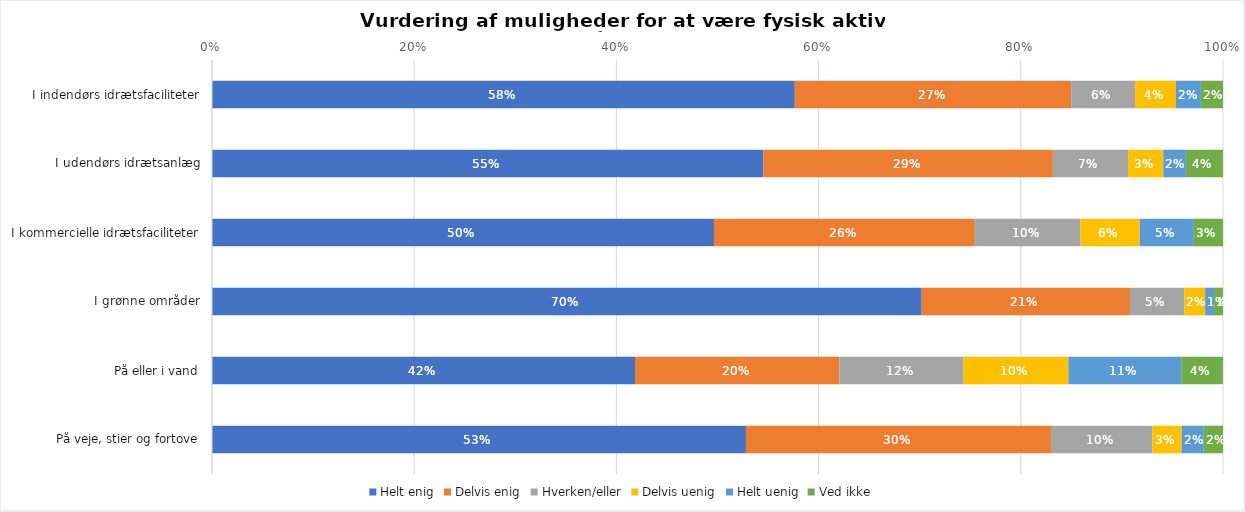
| Category | Helt enig | Delvis enig | Hverken/eller | Delvis uenig | Helt uenig | Ved ikke |
|---|---|---|---|---|---|---|
| I indendørs idrætsfaciliteter | 0.576 | 0.273 | 0.063 | 0.04 | 0.025 | 0.022 |
| I udendørs idrætsanlæg | 0.545 | 0.286 | 0.074 | 0.035 | 0.022 | 0.037 |
| I kommercielle idrætsfaciliteter | 0.497 | 0.258 | 0.105 | 0.059 | 0.053 | 0.029 |
| I grønne områder | 0.702 | 0.206 | 0.054 | 0.02 | 0.009 | 0.009 |
| På eller i vand | 0.418 | 0.202 | 0.123 | 0.104 | 0.112 | 0.041 |
| På veje, stier og fortove | 0.528 | 0.302 | 0.1 | 0.029 | 0.022 | 0.019 |